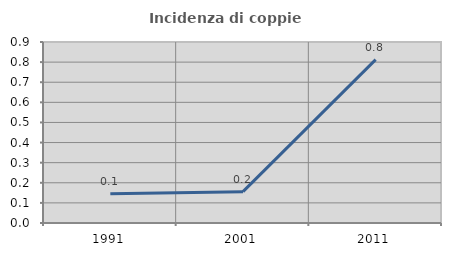
| Category | Incidenza di coppie miste |
|---|---|
| 1991.0 | 0.146 |
| 2001.0 | 0.156 |
| 2011.0 | 0.812 |